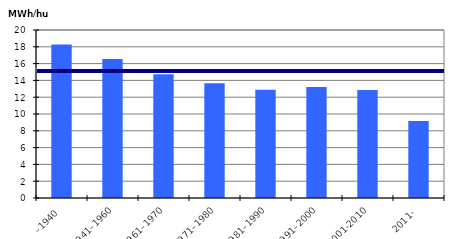
| Category | MWH/hus |
|---|---|
| –1940 | 18.281 |
| 1941–1960 | 16.552 |
| 1961–1970 | 14.728 |
| 1971–1980 | 13.672 |
| 1981–1990 | 12.886 |
| 1991–2000 | 13.203 |
| 2001-2010 | 12.872 |
| 2011- | 9.177 |